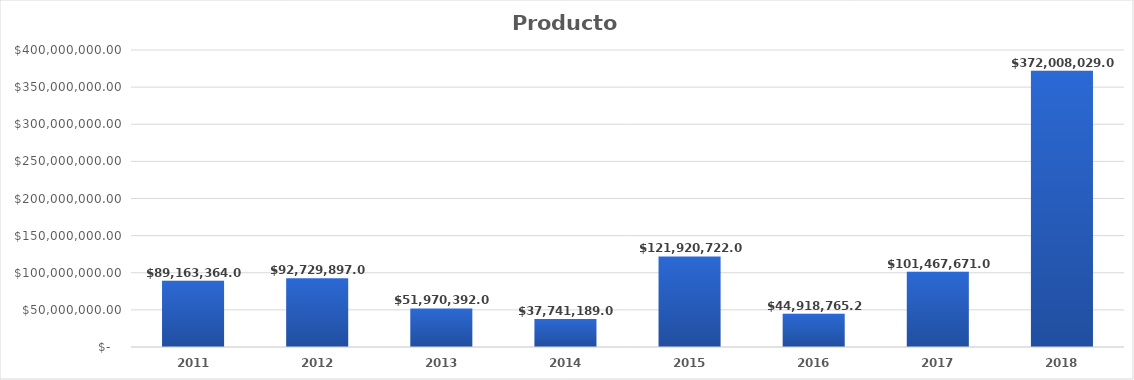
| Category | Productos |
|---|---|
| 2011.0 | 89163364 |
| 2012.0 | 92729897 |
| 2013.0 | 51970392 |
| 2014.0 | 37741189 |
| 2015.0 | 121920722 |
| 2016.0 | 44918765.29 |
| 2017.0 | 101467671 |
| 2018.0 | 372008029 |